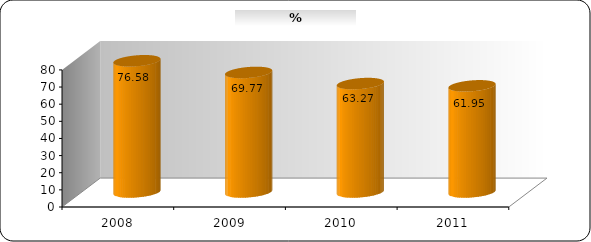
| Category | % zamestnanosti |
|---|---|
| 2008.0 | 76.58 |
| 2009.0 | 69.77 |
| 2010.0 | 63.27 |
| 2011.0 | 61.95 |